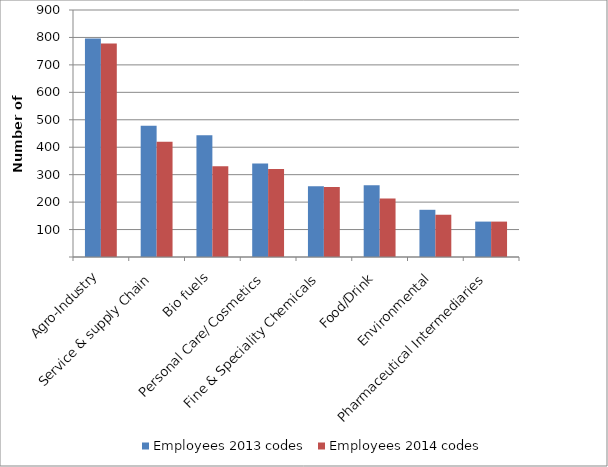
| Category | Employees 2013 codes | Employees 2014 codes |
|---|---|---|
| Agro-Industry | 796 | 778 |
| Service & supply Chain | 478 | 420 |
| Bio fuels | 444 | 331 |
| Personal Care/ Cosmetics | 341 | 321 |
| Fine & Speciality Chemicals | 257.75 | 255 |
| Food/Drink | 261 | 213 |
| Environmental | 172 | 154 |
| Pharmaceutical Intermediaries | 129 | 129 |